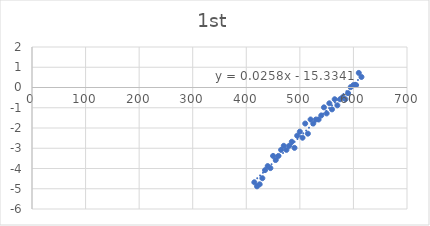
| Category | Series 0 |
|---|---|
| 415.0 | -4.68 |
| 420.0 | -4.88 |
| 425.0 | -4.78 |
| 430.0 | -4.48 |
| 435.0 | -4.08 |
| 440.0 | -3.88 |
| 445.0 | -3.98 |
| 450.0 | -3.38 |
| 455.0 | -3.58 |
| 460.0 | -3.38 |
| 465.0 | -3.08 |
| 470.0 | -2.88 |
| 475.0 | -3.08 |
| 480.0 | -2.88 |
| 485.0 | -2.68 |
| 490.0 | -2.98 |
| 495.0 | -2.38 |
| 500.0 | -2.18 |
| 505.0 | -2.48 |
| 510.0 | -1.78 |
| 515.0 | -2.28 |
| 520.0 | -1.58 |
| 525.0 | -1.78 |
| 530.0 | -1.58 |
| 535.0 | -1.58 |
| 540.0 | -1.38 |
| 545.0 | -0.98 |
| 550.0 | -1.28 |
| 555.0 | -0.78 |
| 560.0 | -1.08 |
| 565.0 | -0.58 |
| 570.0 | -0.88 |
| 575.0 | -0.58 |
| 580.0 | -0.48 |
| 585.0 | -0.58 |
| 590.0 | -0.28 |
| 595.0 | 0.02 |
| 600.0 | 0.12 |
| 605.0 | 0.12 |
| 610.0 | 0.72 |
| 615.0 | 0.52 |